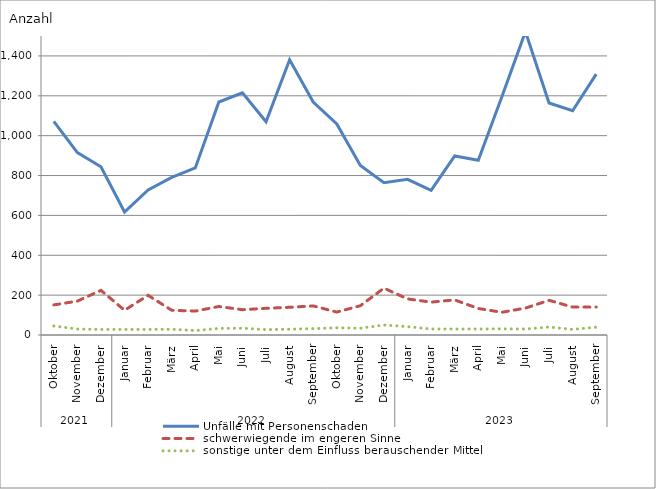
| Category | Unfälle mit Personenschaden | schwerwiegende im engeren Sinne | sonstige unter dem Einfluss berauschender Mittel |
|---|---|---|---|
| 0 | 1072 | 151 | 45 |
| 1 | 915 | 170 | 30 |
| 2 | 844 | 224 | 28 |
| 3 | 617 | 124 | 28 |
| 4 | 728 | 199 | 28 |
| 5 | 791 | 124 | 29 |
| 6 | 838 | 120 | 22 |
| 7 | 1169 | 143 | 33 |
| 8 | 1215 | 127 | 34 |
| 9 | 1070 | 134 | 27 |
| 10 | 1381 | 139 | 29 |
| 11 | 1169 | 146 | 32 |
| 12 | 1059 | 115 | 36 |
| 13 | 850 | 147 | 34 |
| 14 | 764 | 235 | 50 |
| 15 | 781 | 181 | 42 |
| 16 | 726 | 165 | 30 |
| 17 | 898 | 176 | 30 |
| 18 | 877 | 133 | 30 |
| 19 | 1195 | 114 | 31 |
| 20 | 1522 | 135 | 30 |
| 21 | 1164 | 174 | 40 |
| 22 | 1125 | 140 | 28 |
| 23 | 1309 | 140 | 39 |